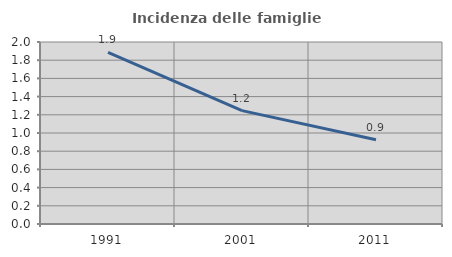
| Category | Incidenza delle famiglie numerose |
|---|---|
| 1991.0 | 1.886 |
| 2001.0 | 1.246 |
| 2011.0 | 0.926 |